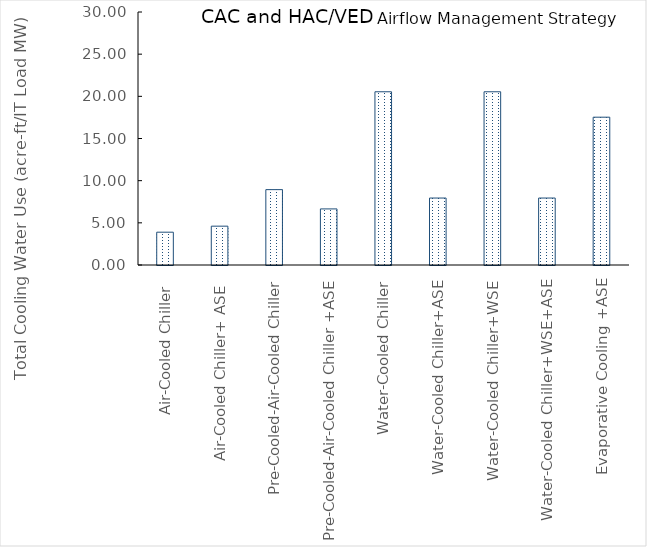
| Category | Series 0 |
|---|---|
| Air-Cooled Chiller  | 3.89 |
| Air-Cooled Chiller+ ASE  | 4.605 |
| Pre-Cooled-Air-Cooled Chiller | 8.937 |
| Pre-Cooled-Air-Cooled Chiller +ASE | 6.65 |
| Water-Cooled Chiller | 20.54 |
| Water-Cooled Chiller+ASE | 7.94 |
| Water-Cooled Chiller+WSE | 20.54 |
| Water-Cooled Chiller+WSE+ASE | 7.94 |
| Evaporative Cooling +ASE | 17.526 |